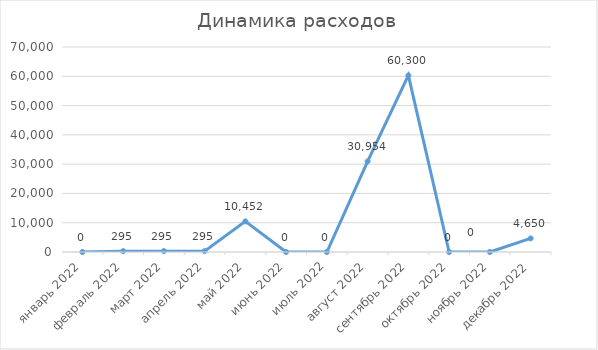
| Category | Series 0 |
|---|---|
| 2022-01-01 | 0 |
| 2022-02-01 | 295 |
| 2022-03-04 | 295 |
| 2022-04-04 | 295 |
| 2022-05-05 | 10452 |
| 2022-06-05 | 0 |
| 2022-07-06 | 0 |
| 2022-08-06 | 30954 |
| 2022-09-06 | 60300 |
| 2022-10-07 | 0 |
| 2022-11-07 | 0 |
| 2022-12-08 | 4650 |